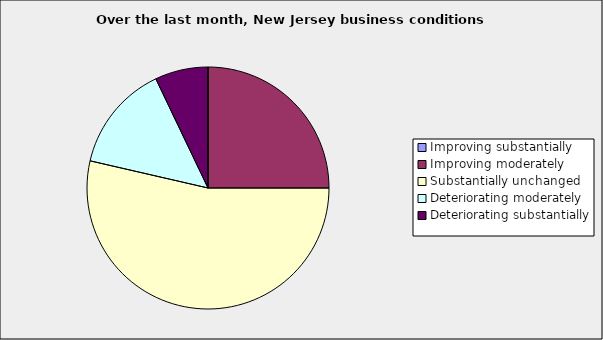
| Category | Series 0 |
|---|---|
| Improving substantially | 0 |
| Improving moderately | 0.25 |
| Substantially unchanged | 0.536 |
| Deteriorating moderately | 0.143 |
| Deteriorating substantially | 0.071 |